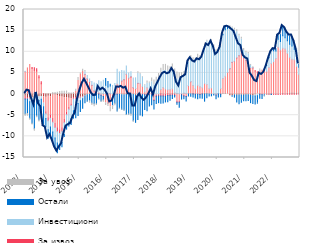
| Category | По трансакционим рачунима | За ликвидност и обртна средства  | За извоз | Инвестициони | Остали | За увоз |
|---|---|---|---|---|---|---|
| 2013-01-01 | -0.509 | 5.346 | -0.651 | 0.035 | -3.527 | -0.631 |
| 2013-02-01 | -0.821 | 6.175 | -0.351 | -0.023 | -3.409 | -0.646 |
| 2013-03-01 | -0.908 | 7.001 | -0.174 | -0.723 | -3.937 | -0.472 |
| 2013-04-01 | -0.906 | 6.112 | 0.185 | -0.925 | -5.053 | -0.444 |
| 2013-05-01 | -1.029 | 5.646 | 0.559 | -1.342 | -5.854 | -0.539 |
| 2013-06-01 | -0.716 | 5.428 | 0.583 | -0.326 | -4.122 | -0.465 |
| 2013-07-01 | -0.657 | 3.831 | 0.52 | -0.86 | -4.6 | -0.517 |
| 2013-08-01 | -0.572 | 2.418 | 0.469 | -0.651 | -4.434 | -0.212 |
| 2013-09-01 | -0.598 | -1.548 | 0.045 | -0.867 | -4.321 | -0.175 |
| 2013-10-01 | -0.733 | -3.459 | -0.474 | -1.128 | -2.012 | -0.04 |
| 2013-11-01 | -0.535 | -5.055 | -0.691 | -2.126 | -2.01 | 0.027 |
| 2013-12-01 | -0.633 | -4.306 | -0.786 | -2.057 | -1.833 | 0.034 |
| 2014-01-01 | -0.249 | -5.51 | -0.913 | -2.28 | -2.331 | 0.385 |
| 2014-02-01 | -0.245 | -6.706 | -0.958 | -2.451 | -2.503 | 0.391 |
| 2014-03-01 | -0.313 | -7.671 | -0.905 | -2.684 | -2.321 | 0.414 |
| 2014-04-01 | -0.6 | -7.826 | -0.87 | -2.823 | -1.007 | 0.607 |
| 2014-05-01 | -0.68 | -7.28 | -0.828 | -2.67 | -0.986 | 0.678 |
| 2014-06-01 | -0.892 | -5.114 | -0.756 | -2.794 | -0.48 | 0.658 |
| 2014-07-01 | -0.864 | -3.398 | -0.666 | -2.577 | -0.783 | 0.724 |
| 2014-08-01 | -1.007 | -2.138 | -0.462 | -2.97 | -0.949 | 0.304 |
| 2014-09-01 | -1.025 | -1.314 | -0.371 | -3.064 | -1.444 | 0.273 |
| 2014-10-01 | -0.822 | 0.079 | -0.337 | -2.797 | -1.737 | 0.282 |
| 2014-11-01 | -0.861 | 0.626 | -0.276 | -2.118 | -2.339 | 0.492 |
| 2014-12-01 | -0.58 | 3.218 | -0.262 | -1.376 | -2.832 | 0.715 |
| 2015-01-01 | -0.714 | 4.647 | -0.14 | -0.735 | -2.54 | 0.363 |
| 2015-02-01 | -0.566 | 5.315 | -0.109 | -0.44 | -2.264 | 0.58 |
| 2015-03-01 | -0.435 | 4.615 | 0.01 | 0.628 | -1.638 | 0.315 |
| 2015-04-01 | -0.176 | 3.558 | 0.045 | 0.803 | -1.506 | -0.203 |
| 2015-05-01 | -0.054 | 2.904 | 0.069 | 0.614 | -1.521 | -0.587 |
| 2015-06-01 | 0.05 | 1.948 | 0.064 | 0.883 | -2.136 | -0.557 |
| 2015-07-01 | 0.129 | 0.588 | 0.07 | 1.82 | -2.288 | -0.686 |
| 2015-08-01 | 0.104 | 0.076 | -0.066 | 2.257 | -2.261 | -0.38 |
| 2015-09-01 | 0.113 | 0.321 | -0.054 | 2.713 | -1.044 | -0.289 |
| 2015-10-01 | 0.038 | -0.248 | -0.058 | 2.851 | -1.314 | -0.292 |
| 2015-11-01 | 0.131 | -0.528 | -0.074 | 3.164 | -0.796 | -0.512 |
| 2015-12-01 | 0.06 | -2.064 | 0.009 | 2.012 | 1.582 | -0.668 |
| 2016-01-01 | 0.112 | -2.142 | -0.029 | 1.532 | 1.328 | -0.779 |
| 2016-02-01 | 0.086 | -2.986 | 0.005 | 1.839 | 0.394 | -1.2 |
| 2016-03-01 | 0.054 | -0.971 | -0.022 | 1.969 | -1.7 | -0.971 |
| 2016-04-01 | 0.002 | 0.443 | -0.024 | 2.055 | -2.16 | -0.577 |
| 2016-05-01 | -0.049 | 2.379 | -0.014 | 3.512 | -3.923 | -0.208 |
| 2016-06-01 | -0.049 | 2.113 | 0.004 | 3.111 | -3.293 | -0.268 |
| 2016-07-01 | -0.188 | 3.113 | 0.004 | 2.467 | -3.427 | -0.165 |
| 2016-08-01 | -0.222 | 3.414 | 0.003 | 2.014 | -3.55 | -0.262 |
| 2016-09-01 | -0.107 | 4.67 | 0.003 | 1.96 | -4.701 | -0.211 |
| 2016-10-01 | -0.069 | 3.806 | 0.02 | 1.146 | -4.647 | -0.197 |
| 2016-11-01 | 0.003 | 4.055 | 0.117 | 1.124 | -4.666 | -0.598 |
| 2016-12-01 | -0.127 | 1.511 | 0.069 | 2.236 | -6.202 | -0.334 |
| 2017-01-01 | -0.288 | 1.276 | 0.033 | 2.51 | -6.392 | 0.022 |
| 2017-02-01 | -0.028 | 2.51 | 0.032 | 2.398 | -6.003 | 0.333 |
| 2017-03-01 | -0.213 | 2.477 | -0.061 | 2.225 | -4.662 | 0.246 |
| 2017-04-01 | 0.006 | 1.831 | -0.118 | 2.184 | -5.039 | 0.13 |
| 2017-05-01 | -0.021 | 0.475 | -0.132 | 1.499 | -3.493 | 0.207 |
| 2017-06-01 | -0.058 | 1.481 | -0.147 | 1.097 | -3.76 | 0.505 |
| 2017-07-01 | 0.066 | 0.598 | -0.146 | 1.924 | -2.666 | 0.256 |
| 2017-08-01 | 0.095 | 0.943 | -0.148 | 1.877 | -2.402 | 0.88 |
| 2017-09-01 | -0.033 | -1.152 | -0.337 | 2.19 | -2.013 | 1.113 |
| 2017-10-01 | 0.036 | -0.151 | -0.348 | 2.896 | -1.739 | 1.06 |
| 2017-11-01 | -0.038 | 0.038 | -0.42 | 3.24 | -1.584 | 1.591 |
| 2017-12-01 | 0.112 | 0.977 | -0.469 | 3.609 | -1.704 | 1.433 |
| 2018-01-01 | -0.017 | 1.525 | -0.446 | 4.005 | -1.648 | 1.463 |
| 2018-02-01 | -0.077 | 1.237 | -0.443 | 4.341 | -1.342 | 1.444 |
| 2018-03-01 | 0.182 | 0.819 | -0.351 | 4.376 | -1.49 | 1.268 |
| 2018-04-01 | 0.071 | 0.951 | -0.295 | 4.091 | -1.173 | 1.367 |
| 2018-05-01 | 0.137 | 1.093 | -0.294 | 4.306 | -0.764 | 1.557 |
| 2018-06-01 | 0.285 | -0.027 | -0.275 | 4.466 | -0.403 | 1.177 |
| 2018-07-01 | 0.145 | -1.649 | -0.279 | 3.416 | -0.5 | 1.678 |
| 2018-08-01 | 0.047 | -1.673 | -0.275 | 3.718 | -1.158 | 1.273 |
| 2018-09-01 | 0.188 | -0.104 | -0.087 | 3.905 | -0.993 | 0.959 |
| 2018-10-01 | 0.166 | -0.346 | -0.086 | 4.215 | -0.685 | 0.9 |
| 2018-11-01 | 0.152 | -0.467 | -0.083 | 5.676 | -1.111 | 0.383 |
| 2018-12-01 | 0.122 | 1.844 | 0.005 | 5.631 | -0.459 | 0.689 |
| 2019-01-01 | 0.084 | 2.809 | 0.003 | 5.72 | -0.538 | 0.514 |
| 2019-02-01 | 0.122 | 1.928 | -0.001 | 6.03 | -0.717 | 0.484 |
| 2019-03-01 | -0.044 | 1.247 | -0.007 | 6.358 | -0.896 | 0.926 |
| 2019-04-01 | -0.017 | 2.07 | -0.007 | 6.386 | -1.065 | 0.967 |
| 2019-05-01 | -0.066 | 1.735 | -0.007 | 6.75 | -0.885 | 0.592 |
| 2019-06-01 | 0.072 | 1.417 | -0.011 | 7.589 | -0.96 | 0.595 |
| 2019-07-01 | 0.175 | 2.37 | 0 | 8.94 | -1.675 | 0.572 |
| 2019-08-01 | 0.115 | 2.145 | 0 | 10.213 | -0.883 | 0.24 |
| 2019-09-01 | 0.013 | 1.238 | 0 | 10.45 | -0.43 | 0.208 |
| 2019-10-31 | -0.067 | 1.466 | 0 | 11.018 | -0.348 | 0.437 |
| 2019-11-30 | -0.092 | 0.018 | 0 | 10.735 | -0.147 | 0.838 |
| 2019-12-31 | -0.113 | -0.095 | -0.01 | 10.083 | -0.903 | 0.405 |
| 2020-01-31 | 0.054 | 0.059 | -0.01 | 9.891 | -0.685 | 0.53 |
| 2020-02-29 | -0.039 | 1.299 | -0.005 | 9.955 | -0.565 | 0.478 |
| 2020-03-31 | 0.143 | 3.547 | 0 | 10.309 | 0.133 | 0.222 |
| 2020-04-30 | 0.161 | 4.038 | 0 | 11.011 | 0.549 | 0.149 |
| 2020-05-31 | -0.035 | 5.152 | 0.005 | 10.317 | 0.3 | 0.307 |
| 2020-06-30 | -0.384 | 6.013 | 0.022 | 9.514 | 0.217 | 0.411 |
| 2020-07-31 | -0.392 | 7.446 | 0.075 | 8.114 | -0.133 | 0.198 |
| 2020-08-31 | -0.213 | 7.716 | 0.074 | 7.318 | -0.516 | 0.452 |
| 2020-09-30 | -0.278 | 8.503 | 0.072 | 6.149 | -1.624 | 0.502 |
| 2020-10-31 | -0.211 | 9.07 | 0.061 | 4.594 | -2.063 | 0.411 |
| 2020-11-30 | -0.2 | 10.314 | 0.062 | 2.62 | -1.728 | 0.415 |
| 2020-12-31 | -0.292 | 8.616 | 0.053 | 1.664 | -1.309 | 0.43 |
| 2021-01-31 | -0.189 | 8.023 | 0.055 | 1.685 | -1.365 | 0.342 |
| 2021-02-28 | -0.183 | 7.754 | 0.056 | 1.663 | -1.361 | 0.376 |
| 2021-03-31 | -0.284 | 6.169 | 0.054 | 0.542 | -1.745 | 0.241 |
| 2021-04-30 | -0.379 | 6.185 | 0.054 | 0.072 | -1.88 | 0.155 |
| 2021-05-31 | -0.226 | 5.456 | 0.046 | -0.255 | -1.842 | 0.02 |
| 2021-06-30 | -0.026 | 5.2 | 0.026 | -0.364 | -1.767 | -0.11 |
| 2021-07-31 | 0.058 | 5.332 | -0.031 | 0.248 | -0.939 | 0.271 |
| 2021-08-31 | -0.054 | 5.613 | -0.031 | -0.076 | -0.866 | 0.055 |
| 2021-09-30 | 0.036 | 5.791 | -0.031 | -0.212 | -0.159 | -0.232 |
| 2021-10-31 | -0.053 | 5.393 | -0.023 | 1.348 | 0.159 | -0.225 |
| 2021-11-30 | -0.072 | 6.304 | -0.029 | 2.287 | 0.103 | -0.183 |
| 2021-12-31 | 0.061 | 7.169 | -0.041 | 2.832 | -0.06 | 0.046 |
| 2022-01-31 | -0.021 | 7.681 | -0.05 | 2.555 | 0.523 | 0.055 |
| 2022-02-28 | -0.052 | 8.431 | -0.051 | 1.755 | 0.546 | 0.016 |
| 2022-03-31 | -0.028 | 11.071 | -0.051 | 1.909 | 0.888 | 0.169 |
| 2022-04-30 | 0.039 | 10.428 | -0.051 | 1.966 | 1.643 | 0.328 |
| 2022-05-31 | 0.154 | 10.704 | -0.049 | 2.956 | 2.006 | 0.425 |
| 2022-06-30 | 0.044 | 10.632 | -0.044 | 2.65 | 1.934 | 0.514 |
| 2022-07-31 | 0.18 | 9.446 | -0.032 | 3.005 | 1.851 | 0.186 |
| 2022-08-31 | 0.263 | 8.447 | -0.032 | 3.101 | 2.001 | 0.187 |
| 2022-09-30 | 0.24 | 7.997 | -0.031 | 3.114 | 2.176 | 0.46 |
| 2022-10-31 | 0.261 | 7.869 | -0.03 | 2.485 | 1.628 | 0.448 |
| 2022-11-30 | 0.255 | 6.325 | -0.024 | 2.471 | 1.325 | 0.369 |
| 2022-12-31 | 0.244 | 4.37 | -0.007 | 1.734 | 0.617 | 0.188 |